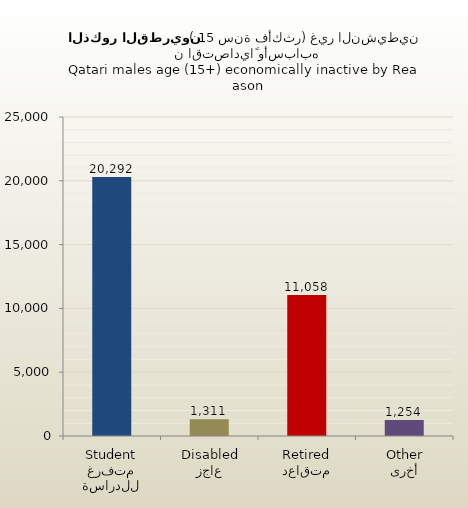
| Category | الذكور القطريين |
|---|---|
| متفرغ للدراسة
Student | 20292 |
| عاجز
Disabled | 1311 |
| متقاعد
Retired | 11058 |
| أخرى
Other | 1254 |